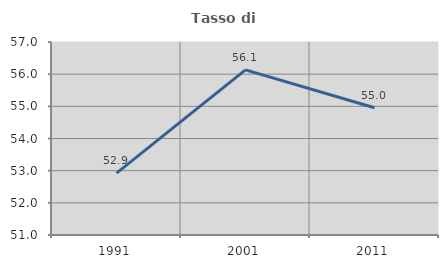
| Category | Tasso di occupazione   |
|---|---|
| 1991.0 | 52.923 |
| 2001.0 | 56.135 |
| 2011.0 | 54.955 |